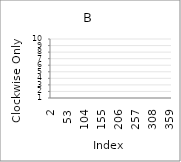
| Category | Series 0 |
|---|---|
| 2.0 | 3 |
| 3.0 | 2 |
| 4.0 | 1 |
| 5.0 | 5 |
| 6.0 | 6 |
| 7.0 | 4 |
| 8.0 | 2 |
| 9.0 | 8 |
| 10.0 | 1 |
| 11.0 | 8 |
| 12.0 | 10 |
| 13.0 | 3 |
| 14.0 | 7 |
| 15.0 | 4 |
| 16.0 | 4 |
| 17.0 | 9 |
| 18.0 | 6 |
| 19.0 | 10 |
| 20.0 | 4 |
| 21.0 | 10 |
| 22.0 | 10 |
| 23.0 | 7 |
| 24.0 | 1 |
| 25.0 | 9 |
| 26.0 | 8 |
| 27.0 | 5 |
| 28.0 | 7 |
| 29.0 | 2 |
| 30.0 | 9 |
| 31.0 | 5 |
| 32.0 | 4 |
| 33.0 | 1 |
| 34.0 | 3 |
| 35.0 | 7 |
| 36.0 | 3 |
| 37.0 | 10 |
| 38.0 | 4 |
| 39.0 | 5 |
| 40.0 | 2 |
| 41.0 | 6 |
| 42.0 | 10 |
| 43.0 | 4 |
| 44.0 | 4 |
| 45.0 | 6 |
| 46.0 | 6 |
| 47.0 | 10 |
| 48.0 | 7 |
| 49.0 | 5 |
| 50.0 | 9 |
| 51.0 | 7 |
| 52.0 | 4 |
| 53.0 | 2 |
| 54.0 | 5 |
| 55.0 | 8 |
| 56.0 | 3 |
| 57.0 | 10 |
| 58.0 | 2 |
| 59.0 | 7 |
| 60.0 | 1 |
| 61.0 | 9 |
| 62.0 | 9 |
| 63.0 | 4 |
| 64.0 | 2 |
| 65.0 | 1 |
| 66.0 | 2 |
| 67.0 | 9 |
| 68.0 | 2 |
| 69.0 | 9 |
| 70.0 | 4 |
| 71.0 | 2 |
| 72.0 | 6 |
| 73.0 | 9 |
| 74.0 | 8 |
| 75.0 | 6 |
| 76.0 | 3 |
| 77.0 | 10 |
| 78.0 | 5 |
| 79.0 | 10 |
| 80.0 | 9 |
| 81.0 | 7 |
| 82.0 | 8 |
| 83.0 | 8 |
| 84.0 | 3 |
| 85.0 | 9 |
| 86.0 | 6 |
| 87.0 | 10 |
| 88.0 | 9 |
| 89.0 | 5 |
| 90.0 | 6 |
| 91.0 | 8 |
| 92.0 | 8 |
| 93.0 | 10 |
| 94.0 | 9 |
| 95.0 | 10 |
| 96.0 | 8 |
| 97.0 | 3 |
| 98.0 | 1 |
| 99.0 | 3 |
| 100.0 | 2 |
| 101.0 | 10 |
| 102.0 | 4 |
| 103.0 | 8 |
| 104.0 | 9 |
| 105.0 | 8 |
| 106.0 | 8 |
| 107.0 | 7 |
| 108.0 | 2 |
| 109.0 | 1 |
| 110.0 | 5 |
| 111.0 | 1 |
| 112.0 | 4 |
| 113.0 | 2 |
| 114.0 | 6 |
| 115.0 | 6 |
| 116.0 | 6 |
| 117.0 | 2 |
| 118.0 | 1 |
| 119.0 | 5 |
| 120.0 | 10 |
| 121.0 | 2 |
| 122.0 | 3 |
| 123.0 | 5 |
| 124.0 | 10 |
| 125.0 | 4 |
| 126.0 | 6 |
| 127.0 | 3 |
| 128.0 | 9 |
| 129.0 | 3 |
| 130.0 | 5 |
| 131.0 | 2 |
| 132.0 | 8 |
| 133.0 | 8 |
| 134.0 | 6 |
| 135.0 | 6 |
| 136.0 | 4 |
| 137.0 | 4 |
| 138.0 | 7 |
| 139.0 | 5 |
| 140.0 | 8 |
| 141.0 | 1 |
| 142.0 | 7 |
| 143.0 | 4 |
| 144.0 | 8 |
| 145.0 | 8 |
| 146.0 | 2 |
| 147.0 | 6 |
| 148.0 | 7 |
| 149.0 | 6 |
| 150.0 | 1 |
| 151.0 | 6 |
| 152.0 | 5 |
| 153.0 | 9 |
| 154.0 | 3 |
| 155.0 | 1 |
| 156.0 | 2 |
| 157.0 | 4 |
| 158.0 | 9 |
| 159.0 | 9 |
| 160.0 | 7 |
| 161.0 | 2 |
| 162.0 | 8 |
| 163.0 | 10 |
| 164.0 | 2 |
| 165.0 | 3 |
| 166.0 | 6 |
| 167.0 | 4 |
| 168.0 | 2 |
| 169.0 | 2 |
| 170.0 | 3 |
| 171.0 | 8 |
| 172.0 | 6 |
| 173.0 | 7 |
| 174.0 | 1 |
| 175.0 | 6 |
| 176.0 | 2 |
| 177.0 | 6 |
| 178.0 | 5 |
| 179.0 | 4 |
| 180.0 | 5 |
| 181.0 | 9 |
| 182.0 | 4 |
| 183.0 | 7 |
| 184.0 | 5 |
| 185.0 | 2 |
| 186.0 | 4 |
| 187.0 | 6 |
| 188.0 | 7 |
| 189.0 | 3 |
| 190.0 | 8 |
| 191.0 | 8 |
| 192.0 | 6 |
| 193.0 | 2 |
| 194.0 | 6 |
| 195.0 | 3 |
| 196.0 | 5 |
| 197.0 | 7 |
| 198.0 | 3 |
| 199.0 | 5 |
| 200.0 | 4 |
| 201.0 | 3 |
| 202.0 | 6 |
| 203.0 | 10 |
| 204.0 | 4 |
| 205.0 | 4 |
| 206.0 | 9 |
| 207.0 | 1 |
| 208.0 | 3 |
| 209.0 | 1 |
| 210.0 | 7 |
| 211.0 | 5 |
| 212.0 | 2 |
| 213.0 | 2 |
| 214.0 | 8 |
| 215.0 | 4 |
| 216.0 | 8 |
| 217.0 | 5 |
| 218.0 | 9 |
| 219.0 | 6 |
| 220.0 | 4 |
| 221.0 | 6 |
| 222.0 | 3 |
| 223.0 | 4 |
| 224.0 | 8 |
| 225.0 | 6 |
| 226.0 | 1 |
| 227.0 | 5 |
| 228.0 | 7 |
| 229.0 | 4 |
| 230.0 | 5 |
| 231.0 | 2 |
| 232.0 | 2 |
| 233.0 | 2 |
| 234.0 | 8 |
| 235.0 | 5 |
| 236.0 | 2 |
| 237.0 | 4 |
| 238.0 | 5 |
| 239.0 | 7 |
| 240.0 | 4 |
| 241.0 | 3 |
| 242.0 | 5 |
| 243.0 | 10 |
| 244.0 | 2 |
| 245.0 | 5 |
| 246.0 | 5 |
| 247.0 | 6 |
| 248.0 | 5 |
| 249.0 | 6 |
| 250.0 | 8 |
| 251.0 | 6 |
| 252.0 | 9 |
| 253.0 | 2 |
| 254.0 | 5 |
| 255.0 | 3 |
| 256.0 | 6 |
| 257.0 | 1 |
| 258.0 | 5 |
| 259.0 | 4 |
| 260.0 | 4 |
| 261.0 | 4 |
| 262.0 | 6 |
| 263.0 | 9 |
| 264.0 | 10 |
| 265.0 | 1 |
| 266.0 | 7 |
| 267.0 | 3 |
| 268.0 | 1 |
| 269.0 | 2 |
| 270.0 | 8 |
| 271.0 | 7 |
| 272.0 | 4 |
| 273.0 | 4 |
| 274.0 | 3 |
| 275.0 | 2 |
| 276.0 | 6 |
| 277.0 | 8 |
| 278.0 | 6 |
| 279.0 | 9 |
| 280.0 | 1 |
| 281.0 | 5 |
| 282.0 | 7 |
| 283.0 | 9 |
| 284.0 | 4 |
| 285.0 | 9 |
| 286.0 | 9 |
| 287.0 | 2 |
| 288.0 | 9 |
| 289.0 | 3 |
| 290.0 | 7 |
| 291.0 | 1 |
| 292.0 | 8 |
| 293.0 | 3 |
| 294.0 | 10 |
| 295.0 | 4 |
| 296.0 | 6 |
| 297.0 | 4 |
| 298.0 | 2 |
| 299.0 | 8 |
| 300.0 | 3 |
| 301.0 | 4 |
| 302.0 | 8 |
| 303.0 | 10 |
| 304.0 | 6 |
| 305.0 | 4 |
| 306.0 | 6 |
| 307.0 | 8 |
| 308.0 | 6 |
| 309.0 | 4 |
| 310.0 | 1 |
| 311.0 | 10 |
| 312.0 | 6 |
| 313.0 | 8 |
| 314.0 | 9 |
| 315.0 | 1 |
| 316.0 | 5 |
| 317.0 | 1 |
| 318.0 | 6 |
| 319.0 | 5 |
| 320.0 | 2 |
| 321.0 | 1 |
| 322.0 | 6 |
| 323.0 | 6 |
| 324.0 | 6 |
| 325.0 | 1 |
| 326.0 | 5 |
| 327.0 | 10 |
| 328.0 | 9 |
| 329.0 | 5 |
| 330.0 | 6 |
| 331.0 | 1 |
| 332.0 | 2 |
| 333.0 | 10 |
| 334.0 | 7 |
| 335.0 | 7 |
| 336.0 | 6 |
| 337.0 | 2 |
| 338.0 | 7 |
| 339.0 | 2 |
| 340.0 | 6 |
| 341.0 | 2 |
| 342.0 | 3 |
| 343.0 | 3 |
| 344.0 | 1 |
| 345.0 | 3 |
| 346.0 | 8 |
| 347.0 | 4 |
| 348.0 | 4 |
| 349.0 | 2 |
| 350.0 | 4 |
| 351.0 | 2 |
| 352.0 | 6 |
| 353.0 | 2 |
| 354.0 | 3 |
| 355.0 | 5 |
| 356.0 | 2 |
| 357.0 | 4 |
| 358.0 | 1 |
| 359.0 | 8 |
| 360.0 | 4 |
| 361.0 | 9 |
| 362.0 | 6 |
| 363.0 | 8 |
| 364.0 | 1 |
| 365.0 | 6 |